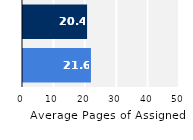
| Category | Series 0 |
|---|---|
| Upper Division | 21.641 |
| Lower Division | 20.405 |